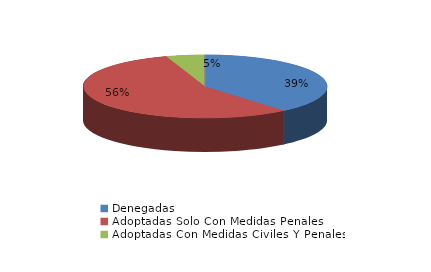
| Category | Series 0 |
|---|---|
| Denegadas | 61 |
| Adoptadas Solo Con Medidas Penales | 88 |
| Adoptadas Con Medidas Civiles Y Penales | 8 |
| Adoptadas Con Medidas Solo Civiles | 0 |